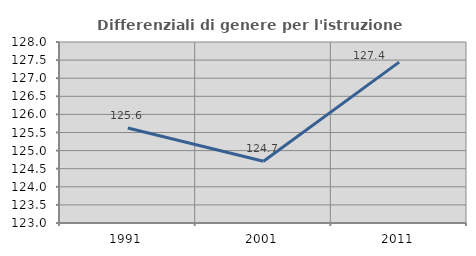
| Category | Differenziali di genere per l'istruzione superiore |
|---|---|
| 1991.0 | 125.622 |
| 2001.0 | 124.707 |
| 2011.0 | 127.443 |